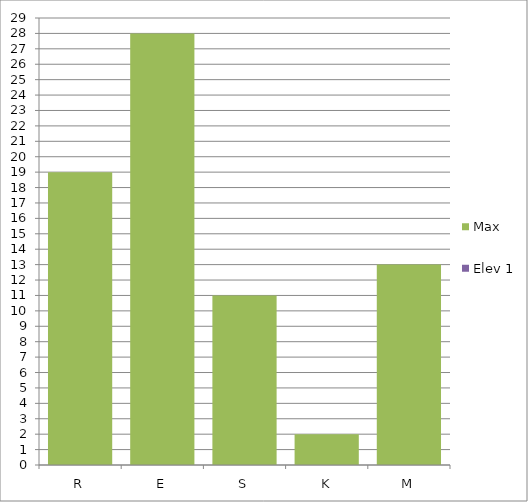
| Category | Max | Elev 1 |
|---|---|---|
| R | 19 | 0 |
| E | 28 | 0 |
| S | 11 | 0 |
| K | 2 | 0 |
| M | 13 | 0 |